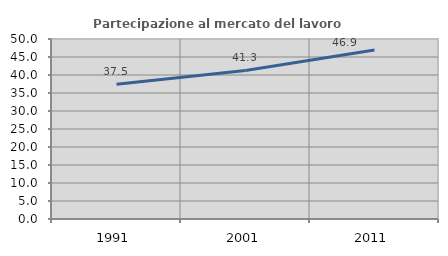
| Category | Partecipazione al mercato del lavoro  femminile |
|---|---|
| 1991.0 | 37.46 |
| 2001.0 | 41.27 |
| 2011.0 | 46.95 |